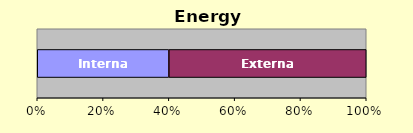
| Category | Internal | External |
|---|---|---|
| 0 | 2 | 3 |